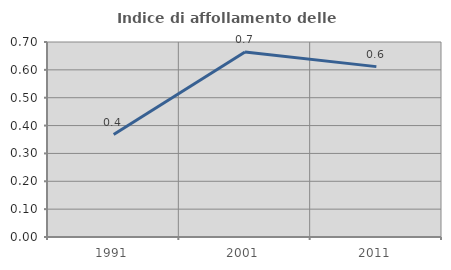
| Category | Indice di affollamento delle abitazioni  |
|---|---|
| 1991.0 | 0.368 |
| 2001.0 | 0.664 |
| 2011.0 | 0.612 |